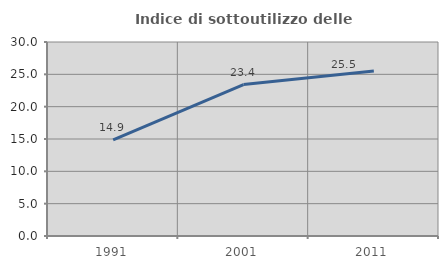
| Category | Indice di sottoutilizzo delle abitazioni  |
|---|---|
| 1991.0 | 14.868 |
| 2001.0 | 23.423 |
| 2011.0 | 25.503 |